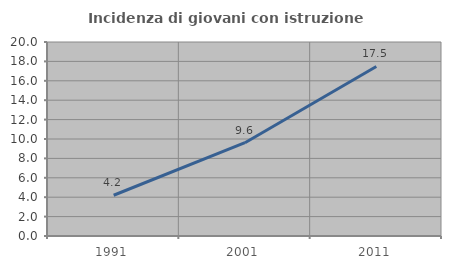
| Category | Incidenza di giovani con istruzione universitaria |
|---|---|
| 1991.0 | 4.202 |
| 2001.0 | 9.615 |
| 2011.0 | 17.481 |